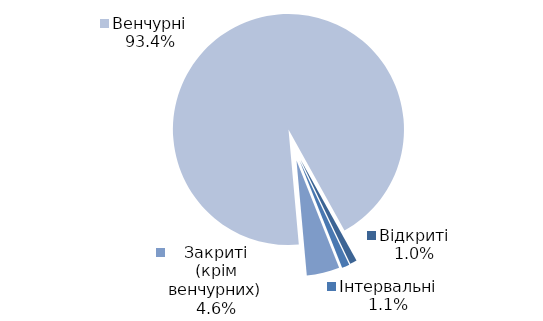
| Category | Series 0 |
|---|---|
| Відкриті | 17 |
| Інтервальні | 19 |
| Закриті (крім венчурних) | 81 |
| Венчурні | 1647 |